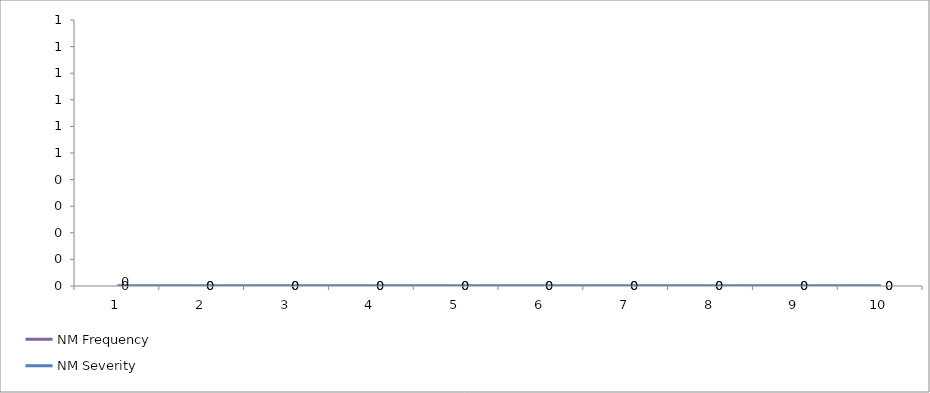
| Category | NM Frequency | NM Severity |
|---|---|---|
| 0 | 0 | 0 |
| 1 | 0 | 0 |
| 2 | 0 | 0 |
| 3 | 0 | 0 |
| 4 | 0 | 0 |
| 5 | 0 | 0 |
| 6 | 0 | 0 |
| 7 | 0 | 0 |
| 8 | 0 | 0 |
| 9 | 0 | 0 |